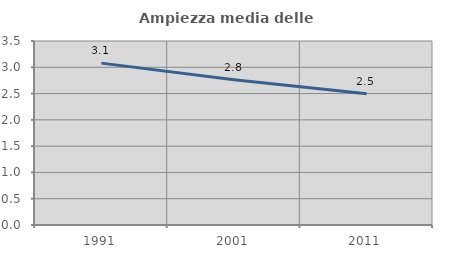
| Category | Ampiezza media delle famiglie |
|---|---|
| 1991.0 | 3.079 |
| 2001.0 | 2.764 |
| 2011.0 | 2.498 |